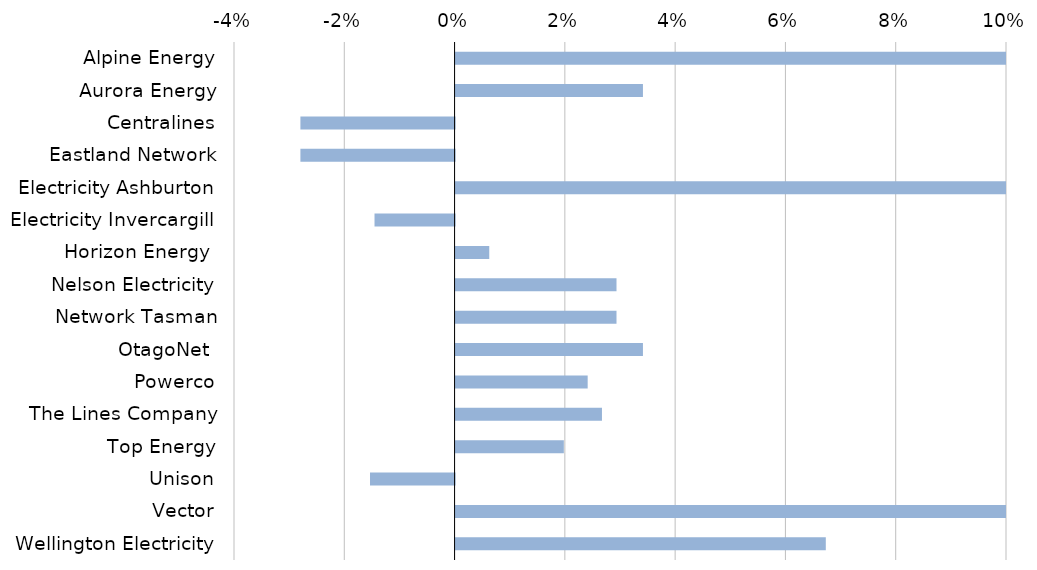
| Category | Cummulative change |
|---|---|
| Alpine Energy | 0.116 |
| Aurora Energy | 0.034 |
| Centralines | -0.028 |
| Eastland Network | -0.028 |
| Electricity Ashburton | 0.116 |
| Electricity Invercargill | -0.015 |
| Horizon Energy  | 0.006 |
| Nelson Electricity | 0.029 |
| Network Tasman | 0.029 |
| OtagoNet  | 0.034 |
| Powerco | 0.024 |
| The Lines Company | 0.027 |
| Top Energy | 0.02 |
| Unison | -0.015 |
| Vector | 0.112 |
| Wellington Electricity | 0.067 |